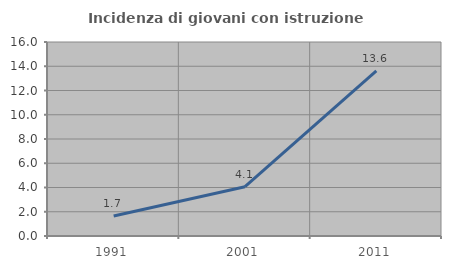
| Category | Incidenza di giovani con istruzione universitaria |
|---|---|
| 1991.0 | 1.653 |
| 2001.0 | 4.068 |
| 2011.0 | 13.609 |